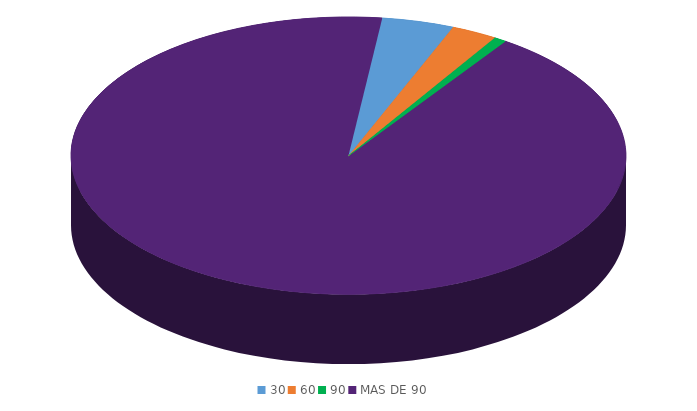
| Category | Series 0 |
|---|---|
| 30 | 1315947.4 |
| 60 | 845966.2 |
| 90 | 219324.6 |
| MAS DE 90 | 28950842.7 |